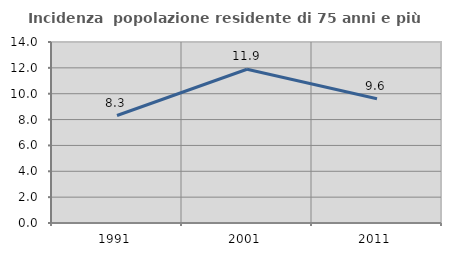
| Category | Incidenza  popolazione residente di 75 anni e più |
|---|---|
| 1991.0 | 8.313 |
| 2001.0 | 11.893 |
| 2011.0 | 9.615 |